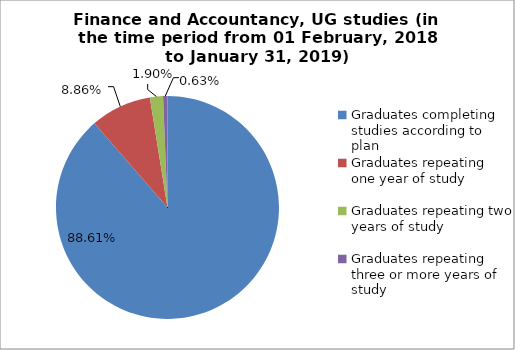
| Category | Series 0 |
|---|---|
| Graduates completing studies according to plan | 88.608 |
| Graduates repeating one year of study | 8.861 |
| Graduates repeating two years of study | 1.899 |
| Graduates repeating three or more years of study | 0.633 |